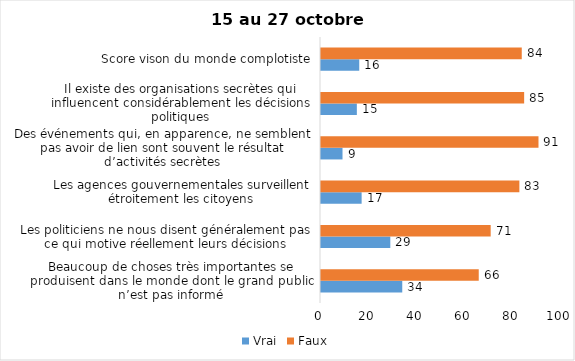
| Category | Vrai | Faux |
|---|---|---|
| Beaucoup de choses très importantes se produisent dans le monde dont le grand public n’est pas informé | 34 | 66 |
| Les politiciens ne nous disent généralement pas ce qui motive réellement leurs décisions | 29 | 71 |
| Les agences gouvernementales surveillent étroitement les citoyens | 17 | 83 |
| Des événements qui, en apparence, ne semblent pas avoir de lien sont souvent le résultat d’activités secrètes | 9 | 91 |
| Il existe des organisations secrètes qui influencent considérablement les décisions politiques | 15 | 85 |
| Score vison du monde complotiste | 16 | 84 |